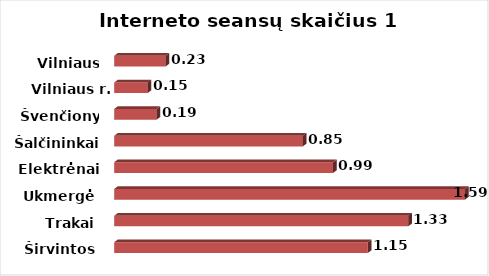
| Category | Series 0 |
|---|---|
| Širvintos | 1.148 |
| Trakai | 1.331 |
| Ukmergė | 1.588 |
| Elektrėnai | 0.99 |
| Šalčininkai | 0.854 |
| Švenčionys | 0.192 |
| Vilniaus r. | 0.151 |
| Vilniaus m. | 0.233 |